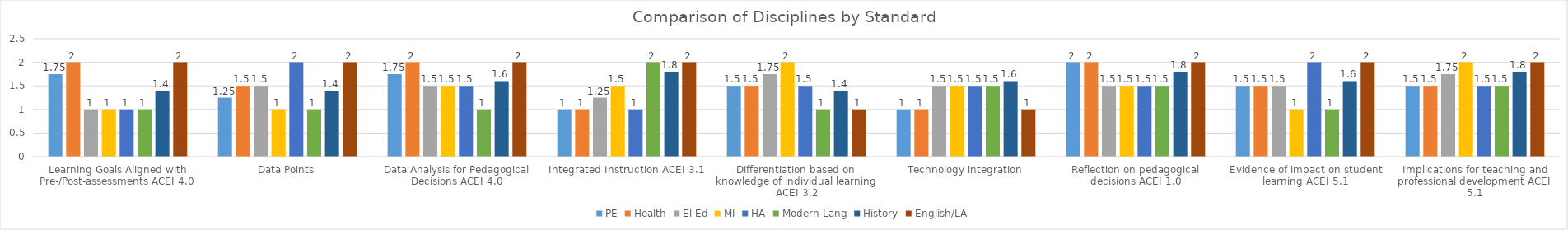
| Category | PE | Health | El Ed | MI | HA | Modern Lang | History | English/LA |
|---|---|---|---|---|---|---|---|---|
| Learning Goals Aligned with Pre-/Post-assessments ACEI 4.0 | 1.75 | 2 | 1 | 1 | 1 | 1 | 1.4 | 2 |
| Data Points | 1.25 | 1.5 | 1.5 | 1 | 2 | 1 | 1.4 | 2 |
| Data Analysis for Pedagogical Decisions ACEI 4.0 | 1.75 | 2 | 1.5 | 1.5 | 1.5 | 1 | 1.6 | 2 |
| Integrated Instruction ACEI 3.1 | 1 | 1 | 1.25 | 1.5 | 1 | 2 | 1.8 | 2 |
| Differentiation based on knowledge of individual learning ACEI 3.2 | 1.5 | 1.5 | 1.75 | 2 | 1.5 | 1 | 1.4 | 1 |
| Technology integration | 1 | 1 | 1.5 | 1.5 | 1.5 | 1.5 | 1.6 | 1 |
| Reflection on pedagogical decisions ACEI 1.0 | 2 | 2 | 1.5 | 1.5 | 1.5 | 1.5 | 1.8 | 2 |
| Evidence of impact on student learning ACEI 5.1 | 1.5 | 1.5 | 1.5 | 1 | 2 | 1 | 1.6 | 2 |
| Implications for teaching and professional development ACEI 5.1 | 1.5 | 1.5 | 1.75 | 2 | 1.5 | 1.5 | 1.8 | 2 |